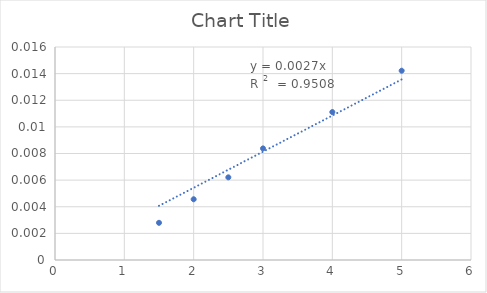
| Category | Series 0 |
|---|---|
| 1.5 | 0.003 |
| 2.0 | 0.005 |
| 2.5 | 0.006 |
| 3.0 | 0.008 |
| 4.0 | 0.011 |
| 5.0 | 0.014 |